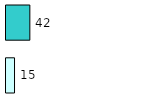
| Category | Series 0 | Series 1 |
|---|---|---|
| 0 | 15 | 42 |